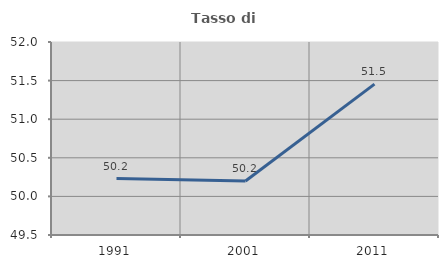
| Category | Tasso di occupazione   |
|---|---|
| 1991.0 | 50.232 |
| 2001.0 | 50.199 |
| 2011.0 | 51.454 |